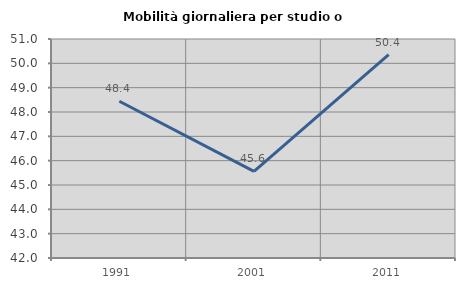
| Category | Mobilità giornaliera per studio o lavoro |
|---|---|
| 1991.0 | 48.443 |
| 2001.0 | 45.56 |
| 2011.0 | 50.359 |